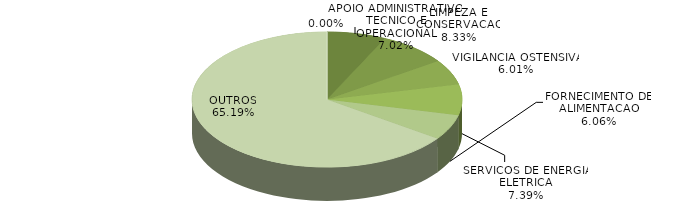
| Category | Series 0 | Series 1 |
|---|---|---|
| APOIO ADMINISTRATIVO, TECNICO E OPERACIONAL | 1489353.11 | 0.07 |
| LIMPEZA E CONSERVACAO | 1768231.84 | 0.083 |
| VIGILANCIA OSTENSIVA | 1275574.45 | 0.06 |
| SERVICOS DE ENERGIA ELETRICA | 1568733.58 | 0.074 |
| FORNECIMENTO DE ALIMENTACAO | 1286993.83 | 0.061 |
| OUTROS | 13840170.13 | 0.652 |